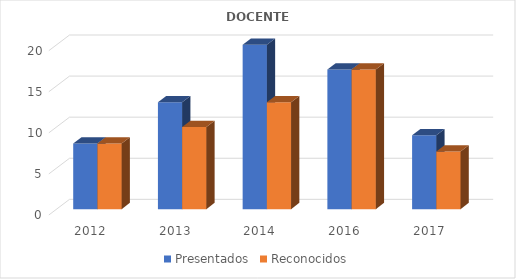
| Category | Presentados | Reconocidos |
|---|---|---|
| 2012.0 | 8 | 8 |
| 2013.0 | 13 | 10 |
| 2014.0 | 20 | 13 |
| 2016.0 | 17 | 17 |
| 2017.0 | 9 | 7 |